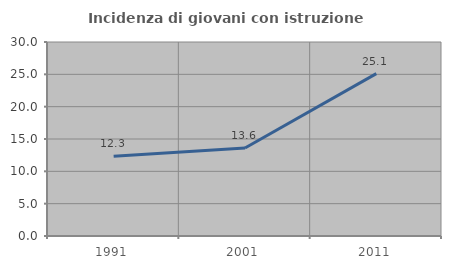
| Category | Incidenza di giovani con istruzione universitaria |
|---|---|
| 1991.0 | 12.329 |
| 2001.0 | 13.6 |
| 2011.0 | 25.101 |